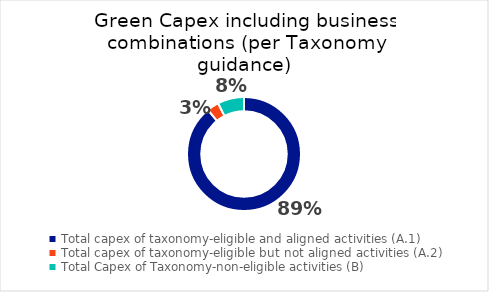
| Category | Series 0 |
|---|---|
| Total capex of taxonomy-eligible and aligned activities (A.1) | 0.891 |
| Total capex of taxonomy-eligible but not aligned activities (A.2) | 0.034 |
| Total Capex of Taxonomy-non-eligible activities (B) | 0.075 |